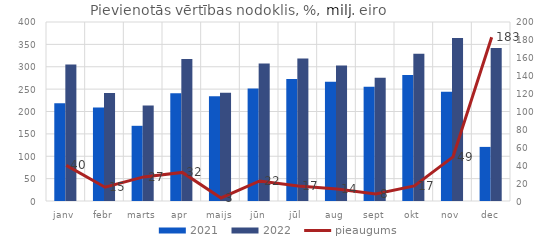
| Category | 2021 | 2022 |
|---|---|---|
| janv | 218.355 | 305.157 |
| febr | 209.043 | 241.225 |
| marts | 168.04 | 213.27 |
| apr | 240.621 | 317.51 |
| maijs | 233.941 | 241.876 |
| jūn | 251.118 | 307.379 |
| jūl | 272.448 | 318.39 |
| aug | 266.644 | 302.725 |
| sept | 255.513 | 275.431 |
| okt | 281.784 | 329.143 |
| nov | 244.096 | 364.477 |
| dec | 120.891 | 342.088 |